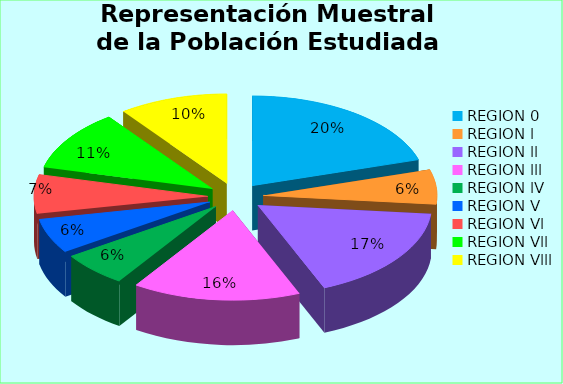
| Category | Series 0 | Series 1 |
|---|---|---|
| REGION 0 | 26 | 0.21 |
| REGION l | 8 | 0.062 |
| REGION ll | 22 | 0.172 |
| REGION lll | 20 | 0.156 |
| REGION lV | 8 | 0.062 |
| REGION V | 8 | 0.062 |
| REGION Vl | 9 | 0.07 |
| REGION Vll | 14 | 0.109 |
| REGION Vlll | 13 | 0.102 |